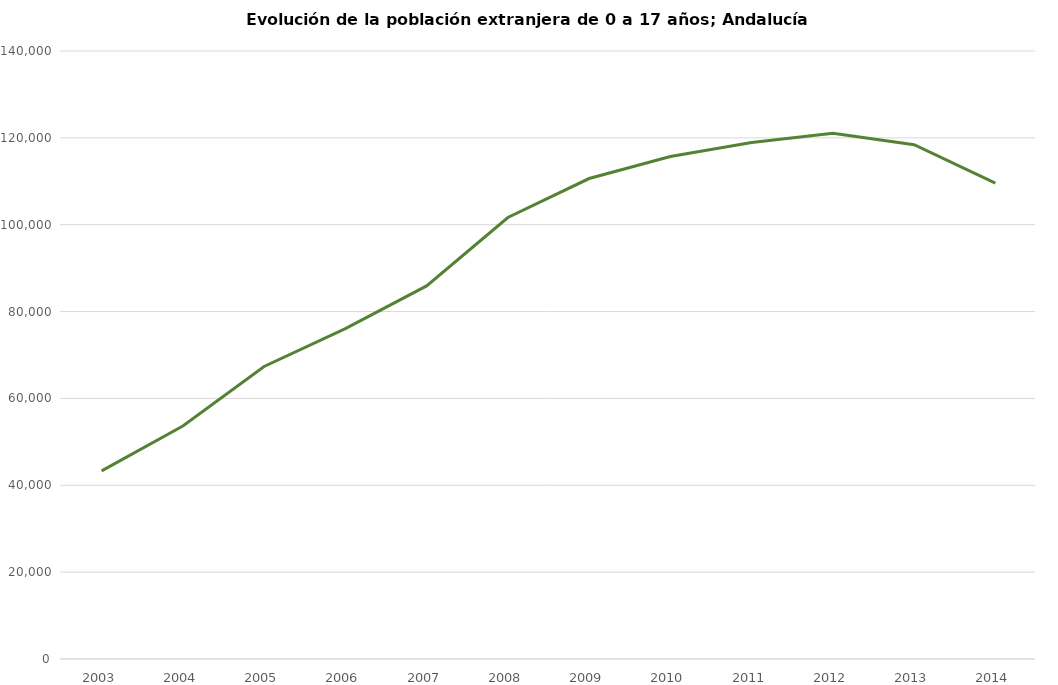
| Category | ANDALUCÍA | Series 1 | Series 2 | Series 3 | Series 4 | Series 5 | Series 6 | Series 7 |
|---|---|---|---|---|---|---|---|---|
| 2003.0 | 43305 |  |  |  |  |  |  |  |
| 2004.0 | 53642 |  |  |  |  |  |  |  |
| 2005.0 | 67353 |  |  |  |  |  |  |  |
| 2006.0 | 76091 |  |  |  |  |  |  |  |
| 2007.0 | 85911 |  |  |  |  |  |  |  |
| 2008.0 | 101664 |  |  |  |  |  |  |  |
| 2009.0 | 110636 |  |  |  |  |  |  |  |
| 2010.0 | 115689 |  |  |  |  |  |  |  |
| 2011.0 | 118906 |  |  |  |  |  |  |  |
| 2012.0 | 121047 |  |  |  |  |  |  |  |
| 2013.0 | 118414 |  |  |  |  |  |  |  |
| 2014.0 | 109558 |  |  |  |  |  |  |  |